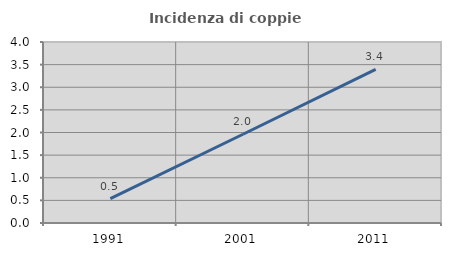
| Category | Incidenza di coppie miste |
|---|---|
| 1991.0 | 0.539 |
| 2001.0 | 1.961 |
| 2011.0 | 3.395 |